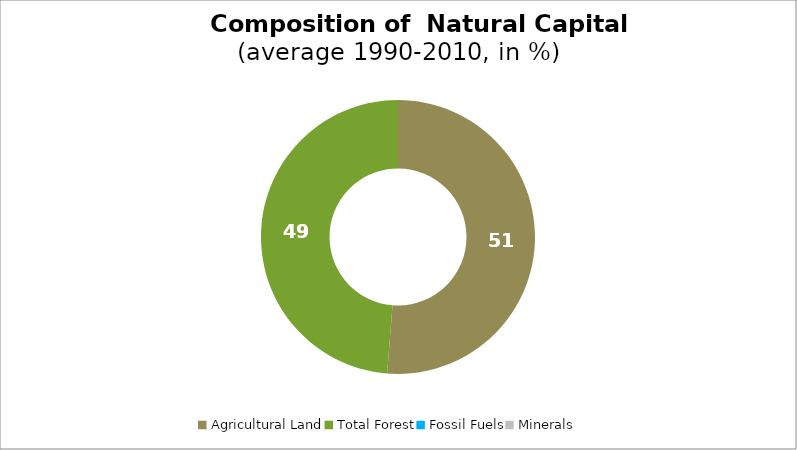
| Category | Series 0 |
|---|---|
| Agricultural Land | 51.266 |
| Total Forest | 48.734 |
| Fossil Fuels | 0 |
| Minerals | 0 |